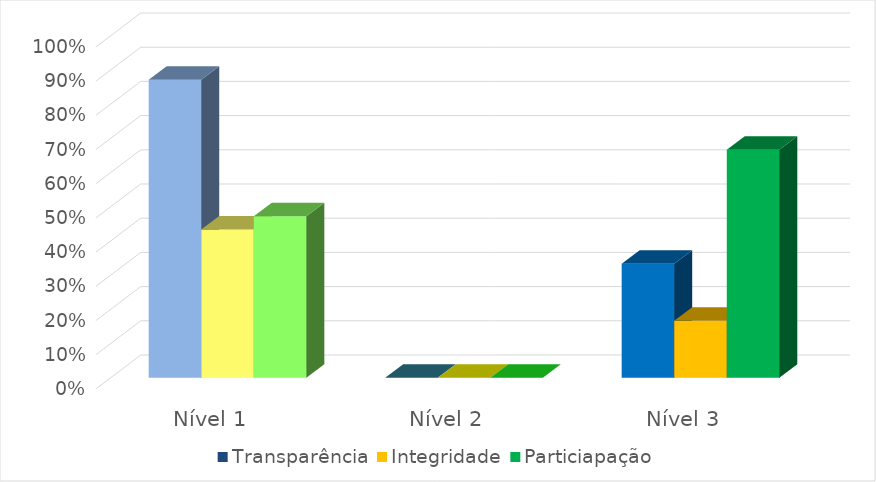
| Category | Transparência | Integridade | Particiapação |
|---|---|---|---|
| Nível 1 | 0.871 | 0.433 | 0.472 |
| Nível 2 | 0 | 0 | 0 |
| Nível 3 | 0.333 | 0.167 | 0.667 |